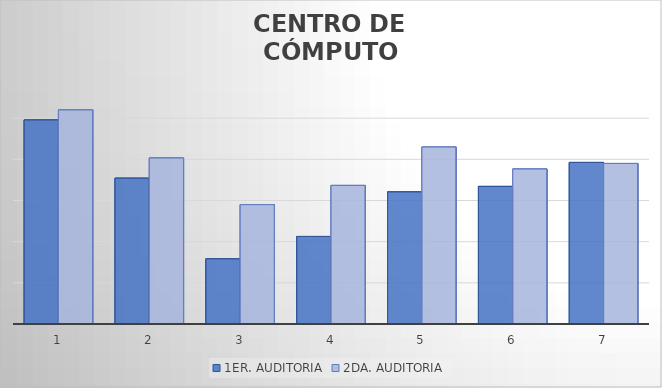
| Category | 1ER. AUDITORIA | 2DA. AUDITORIA |
|---|---|---|
| 0 | 4.392 | 4.44 |
| 1 | 4.108 | 4.207 |
| 2 | 3.717 | 3.98 |
| 3 | 3.825 | 4.073 |
| 4 | 4.042 | 4.26 |
| 5 | 4.068 | 4.153 |
| 6 | 4.185 | 4.18 |